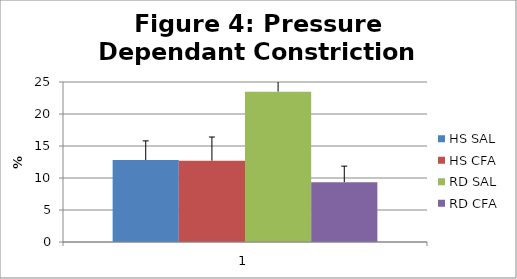
| Category | HS SAL | HS CFA | RD SAL | RD CFA |
|---|---|---|---|---|
| 0 | 12.8 | 12.703 | 23.494 | 9.351 |